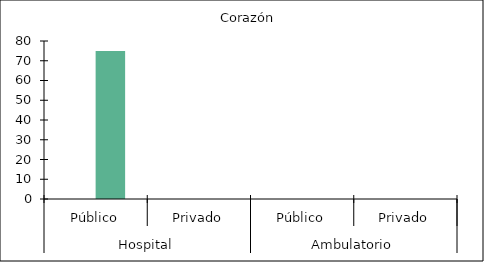
| Category |   |    Corazón |
|---|---|---|
| 0 | 0 | 75 |
| 1 | 0 | 0 |
| 2 | 0 | 0 |
| 3 | 0 | 0 |